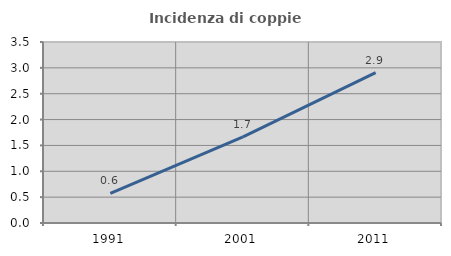
| Category | Incidenza di coppie miste |
|---|---|
| 1991.0 | 0.571 |
| 2001.0 | 1.666 |
| 2011.0 | 2.907 |